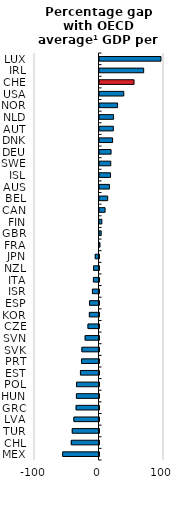
| Category | Percentage gap with OECD average¹ GDP per capita |
|---|---|
| MEX | -56.341 |
| CHL | -42.944 |
| TUR | -41.47 |
| LVA | -38.903 |
| GRC | -35.463 |
| HUN | -35.025 |
| POL | -34.86 |
| EST | -28.767 |
| PRT | -27.046 |
| SVK | -26.502 |
| SVN | -21.458 |
| CZE | -17.073 |
| KOR | -14.945 |
| ESP | -14.686 |
| ISR | -10.176 |
| ITA | -8.635 |
| NZL | -8.335 |
| JPN | -5.814 |
| FRA | 0.744 |
| GBR | 2.647 |
| FIN | 3.667 |
| CAN | 8.649 |
| BEL | 12.705 |
| AUS | 15.45 |
| ISL | 17.143 |
| SWE | 17.496 |
| DEU | 17.927 |
| DNK | 20.371 |
| AUT | 21.469 |
| NLD | 21.788 |
| NOR | 28.073 |
| USA | 37.636 |
| CHE | 53.554 |
| IRL | 68.497 |
| LUX | 95.328 |